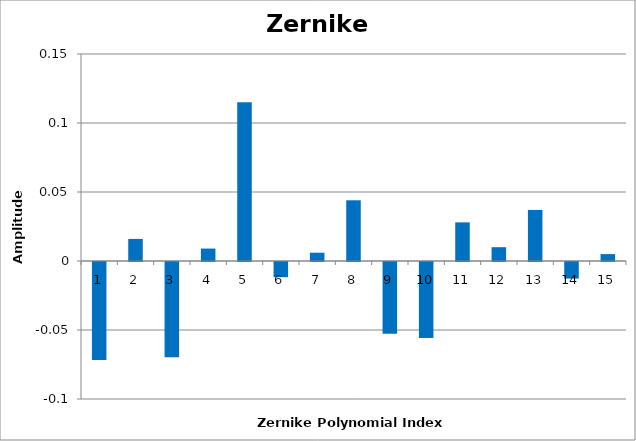
| Category | -0.071 0.016 -0.069 0.009 0.115 -0.011 0.006 0.044 -0.052 -0.055 0.028 0.01 0.037 -0.012 0.005 |
|---|---|
| 1.0 | -0.071 |
| 2.0 | 0.016 |
| 3.0 | -0.069 |
| 4.0 | 0.009 |
| 5.0 | 0.115 |
| 6.0 | -0.011 |
| 7.0 | 0.006 |
| 8.0 | 0.044 |
| 9.0 | -0.052 |
| 10.0 | -0.055 |
| 11.0 | 0.028 |
| 12.0 | 0.01 |
| 13.0 | 0.037 |
| 14.0 | -0.012 |
| 15.0 | 0.005 |